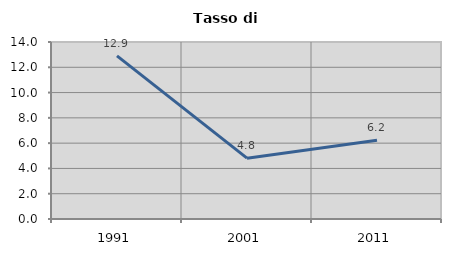
| Category | Tasso di disoccupazione   |
|---|---|
| 1991.0 | 12.903 |
| 2001.0 | 4.81 |
| 2011.0 | 6.237 |